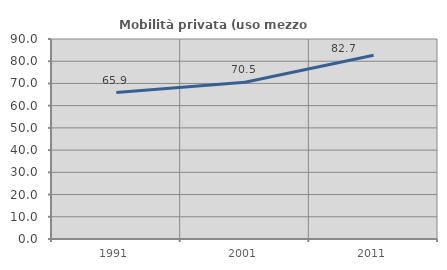
| Category | Mobilità privata (uso mezzo privato) |
|---|---|
| 1991.0 | 65.877 |
| 2001.0 | 70.526 |
| 2011.0 | 82.657 |